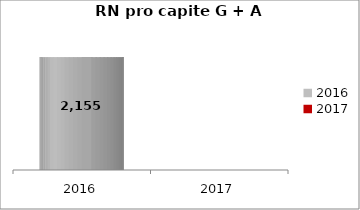
| Category | RN pro capite G + A BG |
|---|---|
| 2016.0 | 2154.777 |
| 2017.0 | 0 |